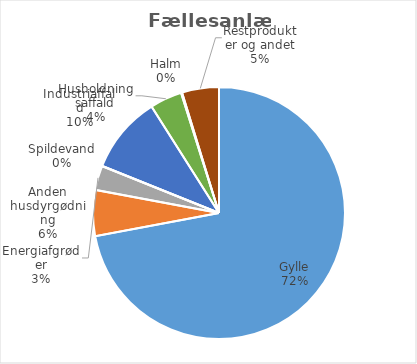
| Category | Series 0 |
|---|---|
| Gylle | 6366243.535 |
| Anden husdyrgødning | 520382.015 |
| Energiafgrøder | 275599.88 |
| Spildevand | 3098 |
| Industriaffald | 875798.48 |
| Husholdningsaffald | 364741.1 |
| Halm | 10863.4 |
| Restprodukter og andet | 418865.97 |